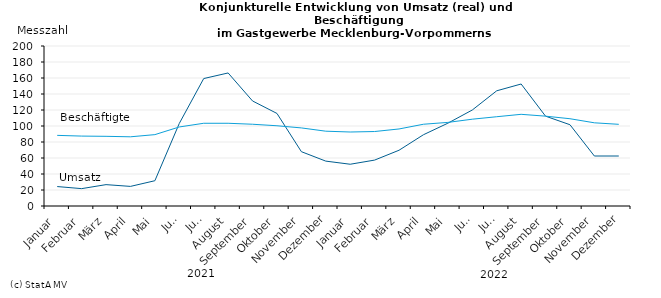
| Category | Umsatz | Beschäftigte |
|---|---|---|
|    Januar | 24.3 | 88.3 |
|    Februar | 21.7 | 87.4 |
|    März | 26.7 | 87.1 |
|    April | 24.5 | 86.5 |
|    Mai | 31.6 | 89.2 |
|    Juni | 103.2 | 98.8 |
|    Juli | 159.3 | 103.4 |
|    August | 166.3 | 103.4 |
|    September | 131.3 | 102.2 |
|    Oktober | 115.7 | 100.3 |
|    November | 67.9 | 97.6 |
|    Dezember | 56.1 | 93.5 |
|    Januar | 52.2 | 92.5 |
|    Februar | 57.4 | 93.1 |
|    März | 69.7 | 96.3 |
|    April | 89.1 | 102.2 |
|    Mai | 103.5 | 104.5 |
|    Juni | 120 | 108.5 |
|    Juli | 144 | 111.6 |
|    August | 152.5 | 114.6 |
|    September | 112.3 | 112.3 |
|    Oktober | 101.6 | 109.1 |
|    November | 62.5 | 104 |
|    Dezember | 62.5 | 102.1 |